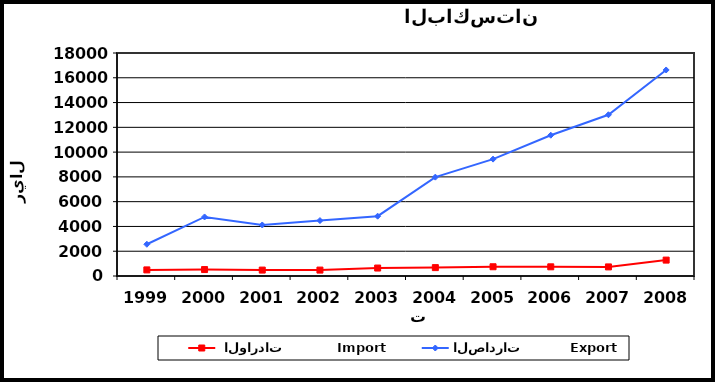
| Category |  الواردات           Import | الصادرات          Export |
|---|---|---|
| 1999.0 | 493 | 2562 |
| 2000.0 | 520 | 4766 |
| 2001.0 | 478 | 4119 |
| 2002.0 | 477 | 4474 |
| 2003.0 | 642 | 4828 |
| 2004.0 | 677 | 7979 |
| 2005.0 | 746 | 9435 |
| 2006.0 | 741 | 11363 |
| 2007.0 | 734 | 13015 |
| 2008.0 | 1283 | 16630 |